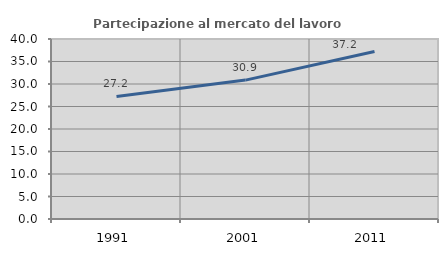
| Category | Partecipazione al mercato del lavoro  femminile |
|---|---|
| 1991.0 | 27.24 |
| 2001.0 | 30.866 |
| 2011.0 | 37.24 |